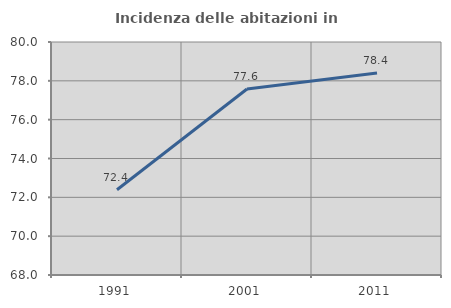
| Category | Incidenza delle abitazioni in proprietà  |
|---|---|
| 1991.0 | 72.389 |
| 2001.0 | 77.579 |
| 2011.0 | 78.399 |